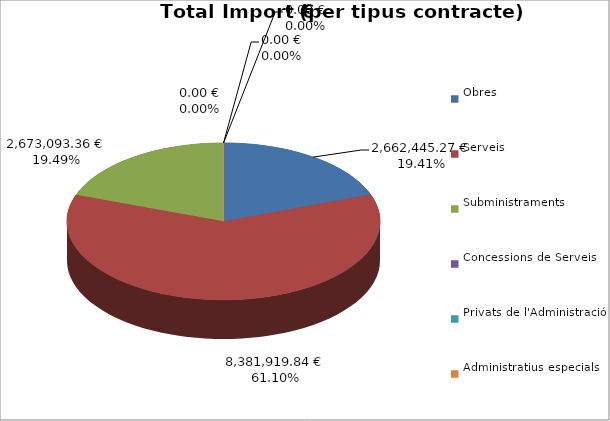
| Category | Total preu
(amb IVA) |
|---|---|
| Obres | 2662445.268 |
| Serveis | 8381919.844 |
| Subministraments | 2673093.364 |
| Concessions de Serveis | 0 |
| Privats de l'Administració | 0 |
| Administratius especials | 0 |